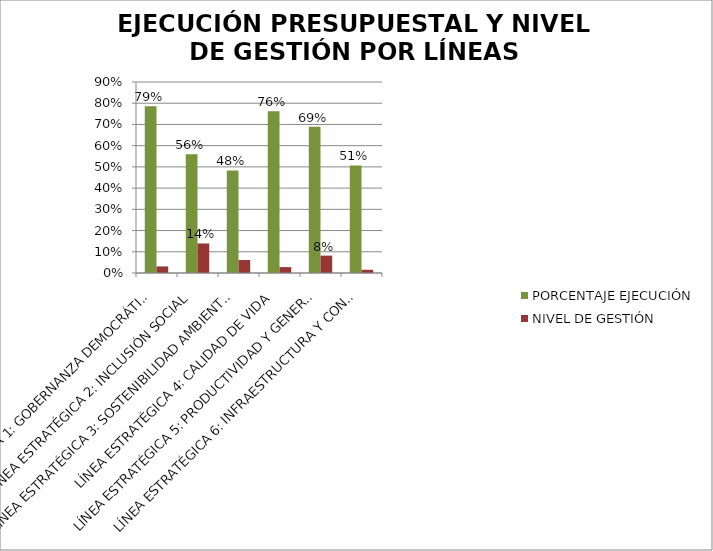
| Category | PORCENTAJE EJECUCIÓN | NIVEL DE GESTIÓN |
|---|---|---|
| LÍNEA ESTRATÉGICA 1: GOBERNANZA DEMOCRÁTICA | 0.785 | 0.031 |
| LÍNEA ESTRATÉGICA 2: INCLUSIÓN SOCIAL | 0.56 | 0.139 |
| LÍNEA ESTRATÉGICA 3: SOSTENIBILIDAD AMBIENTAL | 0.484 | 0.061 |
| LÍNEA ESTRATÉGICA 4: CALIDAD DE VIDA | 0.762 | 0.028 |
| LÍNEA ESTRATÉGICA 5: PRODUCTIVIDAD Y GENERACIÓN DE OPORTUNIDADES | 0.689 | 0.082 |
| LÍNEA ESTRATÉGICA 6: INFRAESTRUCTURA Y CONECTIVIDAD | 0.507 | 0.015 |